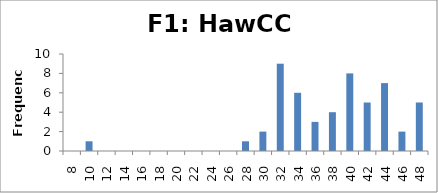
| Category | Frequency |
|---|---|
| 8.0 | 0 |
| 10.0 | 1 |
| 12.0 | 0 |
| 14.0 | 0 |
| 16.0 | 0 |
| 18.0 | 0 |
| 20.0 | 0 |
| 22.0 | 0 |
| 24.0 | 0 |
| 26.0 | 0 |
| 28.0 | 1 |
| 30.0 | 2 |
| 32.0 | 9 |
| 34.0 | 6 |
| 36.0 | 3 |
| 38.0 | 4 |
| 40.0 | 8 |
| 42.0 | 5 |
| 44.0 | 7 |
| 46.0 | 2 |
| 48.0 | 5 |